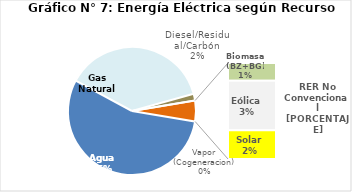
| Category | Series 0 |
|---|---|
| Agua | 2628.222 |
| Gas Natural | 1797.796 |
| Diesel/Residual/Carbón | 81.282 |
| Vapor (Cogeneracion) | 0.301 |
| Biomasa (BZ+BG) | 46.472 |
| Eólica | 128.538 |
| Solar | 75.156 |